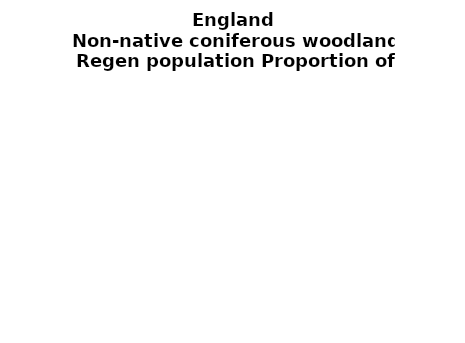
| Category | Non-native coniferous woodland |
|---|---|
| None | 0.108 |
| Seedlings only | 0 |
| Seedlings, saplings only | 0.078 |
| Seedlings, saplings, <7 cm trees | 0.252 |
| Saplings only | 0.103 |
| <7 cm trees, seedlings only | 0 |
| <7 cm trees, saplings only | 0.307 |
| <7 cm Trees only | 0.151 |